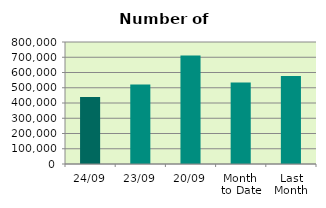
| Category | Series 0 |
|---|---|
| 24/09 | 439766 |
| 23/09 | 521470 |
| 20/09 | 711206 |
| Month 
to Date | 534329.882 |
| Last
Month | 576518.909 |